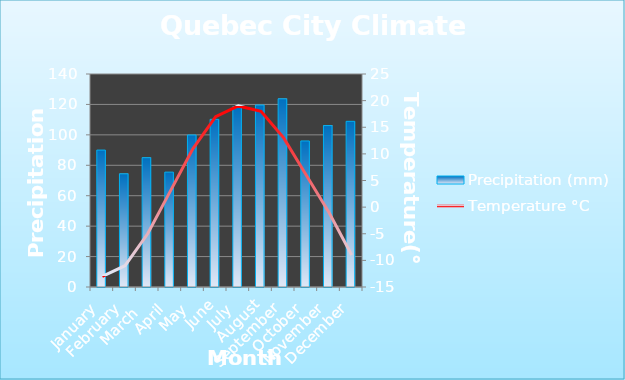
| Category | Precipitation (mm) |
|---|---|
| January | 90 |
| February | 74.4 |
| March  | 85 |
| April | 75.5 |
| May | 99.9 |
| June | 110.2 |
| July | 118.5 |
| August | 119.6 |
| September | 123.7 |
| October | 96 |
| November | 106.1 |
| December | 108.9 |